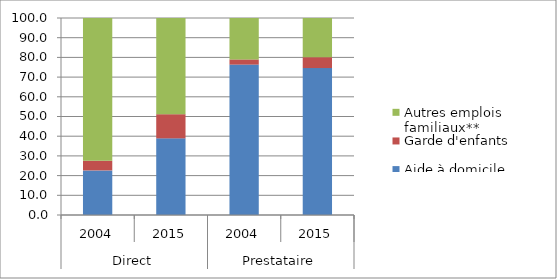
| Category | Aide à domicile | Garde d'enfants | Autres emplois familiaux** |
|---|---|---|---|
| 0 | 22.624 | 4.923 | 72.454 |
| 1 | 38.91 | 12.258 | 48.832 |
| 2 | 76.344 | 2.636 | 21.02 |
| 3 | 74.588 | 5.548 | 19.863 |